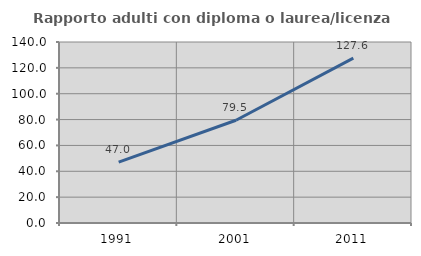
| Category | Rapporto adulti con diploma o laurea/licenza media  |
|---|---|
| 1991.0 | 47.046 |
| 2001.0 | 79.491 |
| 2011.0 | 127.565 |